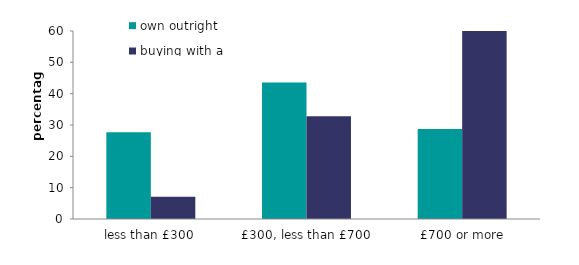
| Category | own outright | buying with a mortgage |
|---|---|---|
| less than £300 | 27.7 | 7.1 |
| £300, less than £700 | 43.6 | 32.8 |
| £700 or more | 28.7 | 60.1 |